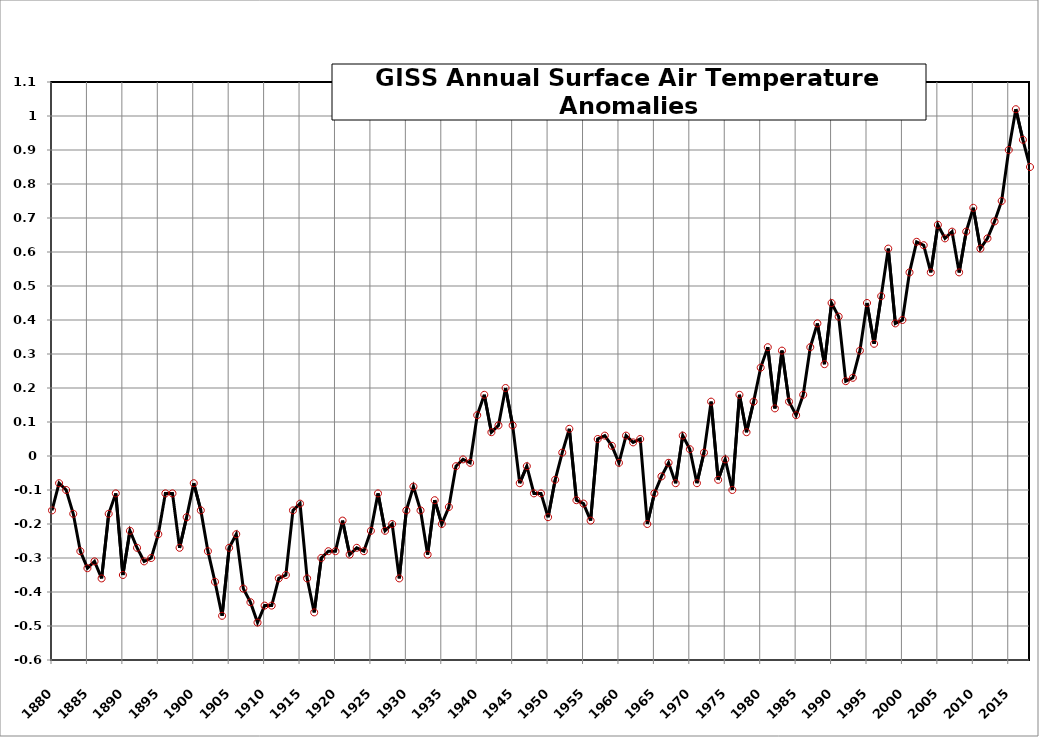
| Category | Series 0 |
|---|---|
| 1880.0 | -0.16 |
| 1881.0 | -0.08 |
| 1882.0 | -0.1 |
| 1883.0 | -0.17 |
| 1884.0 | -0.28 |
| 1885.0 | -0.33 |
| 1886.0 | -0.31 |
| 1887.0 | -0.36 |
| 1888.0 | -0.17 |
| 1889.0 | -0.11 |
| 1890.0 | -0.35 |
| 1891.0 | -0.22 |
| 1892.0 | -0.27 |
| 1893.0 | -0.31 |
| 1894.0 | -0.3 |
| 1895.0 | -0.23 |
| 1896.0 | -0.11 |
| 1897.0 | -0.11 |
| 1898.0 | -0.27 |
| 1899.0 | -0.18 |
| 1900.0 | -0.08 |
| 1901.0 | -0.16 |
| 1902.0 | -0.28 |
| 1903.0 | -0.37 |
| 1904.0 | -0.47 |
| 1905.0 | -0.27 |
| 1906.0 | -0.23 |
| 1907.0 | -0.39 |
| 1908.0 | -0.43 |
| 1909.0 | -0.49 |
| 1910.0 | -0.44 |
| 1911.0 | -0.44 |
| 1912.0 | -0.36 |
| 1913.0 | -0.35 |
| 1914.0 | -0.16 |
| 1915.0 | -0.14 |
| 1916.0 | -0.36 |
| 1917.0 | -0.46 |
| 1918.0 | -0.3 |
| 1919.0 | -0.28 |
| 1920.0 | -0.28 |
| 1921.0 | -0.19 |
| 1922.0 | -0.29 |
| 1923.0 | -0.27 |
| 1924.0 | -0.28 |
| 1925.0 | -0.22 |
| 1926.0 | -0.11 |
| 1927.0 | -0.22 |
| 1928.0 | -0.2 |
| 1929.0 | -0.36 |
| 1930.0 | -0.16 |
| 1931.0 | -0.09 |
| 1932.0 | -0.16 |
| 1933.0 | -0.29 |
| 1934.0 | -0.13 |
| 1935.0 | -0.2 |
| 1936.0 | -0.15 |
| 1937.0 | -0.03 |
| 1938.0 | -0.01 |
| 1939.0 | -0.02 |
| 1940.0 | 0.12 |
| 1941.0 | 0.18 |
| 1942.0 | 0.07 |
| 1943.0 | 0.09 |
| 1944.0 | 0.2 |
| 1945.0 | 0.09 |
| 1946.0 | -0.08 |
| 1947.0 | -0.03 |
| 1948.0 | -0.11 |
| 1949.0 | -0.11 |
| 1950.0 | -0.18 |
| 1951.0 | -0.07 |
| 1952.0 | 0.01 |
| 1953.0 | 0.08 |
| 1954.0 | -0.13 |
| 1955.0 | -0.14 |
| 1956.0 | -0.19 |
| 1957.0 | 0.05 |
| 1958.0 | 0.06 |
| 1959.0 | 0.03 |
| 1960.0 | -0.02 |
| 1961.0 | 0.06 |
| 1962.0 | 0.04 |
| 1963.0 | 0.05 |
| 1964.0 | -0.2 |
| 1965.0 | -0.11 |
| 1966.0 | -0.06 |
| 1967.0 | -0.02 |
| 1968.0 | -0.08 |
| 1969.0 | 0.06 |
| 1970.0 | 0.02 |
| 1971.0 | -0.08 |
| 1972.0 | 0.01 |
| 1973.0 | 0.16 |
| 1974.0 | -0.07 |
| 1975.0 | -0.01 |
| 1976.0 | -0.1 |
| 1977.0 | 0.18 |
| 1978.0 | 0.07 |
| 1979.0 | 0.16 |
| 1980.0 | 0.26 |
| 1981.0 | 0.32 |
| 1982.0 | 0.14 |
| 1983.0 | 0.31 |
| 1984.0 | 0.16 |
| 1985.0 | 0.12 |
| 1986.0 | 0.18 |
| 1987.0 | 0.32 |
| 1988.0 | 0.39 |
| 1989.0 | 0.27 |
| 1990.0 | 0.45 |
| 1991.0 | 0.41 |
| 1992.0 | 0.22 |
| 1993.0 | 0.23 |
| 1994.0 | 0.31 |
| 1995.0 | 0.45 |
| 1996.0 | 0.33 |
| 1997.0 | 0.47 |
| 1998.0 | 0.61 |
| 1999.0 | 0.39 |
| 2000.0 | 0.4 |
| 2001.0 | 0.54 |
| 2002.0 | 0.63 |
| 2003.0 | 0.62 |
| 2004.0 | 0.54 |
| 2005.0 | 0.68 |
| 2006.0 | 0.64 |
| 2007.0 | 0.66 |
| 2008.0 | 0.54 |
| 2009.0 | 0.66 |
| 2010.0 | 0.73 |
| 2011.0 | 0.61 |
| 2012.0 | 0.64 |
| 2013.0 | 0.69 |
| 2014.0 | 0.75 |
| 2015.0 | 0.9 |
| 2016.0 | 1.02 |
| 2017.0 | 0.93 |
| 2018.0 | 0.85 |